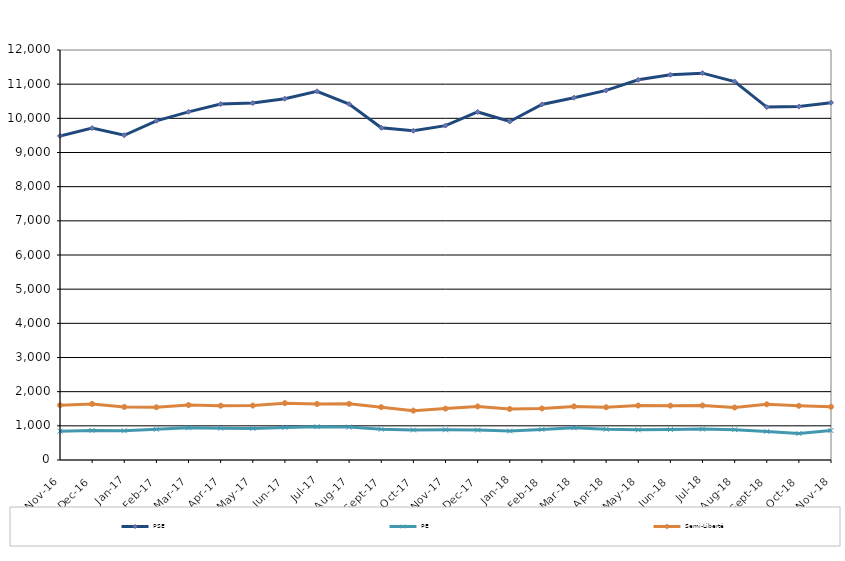
| Category | PSE | PE | Semi-Liberté |
|---|---|---|---|
| 2016-11-01 | 9484 | 844 | 1605 |
| 2016-12-01 | 9714 | 866 | 1641 |
| 2017-01-01 | 9505 | 855 | 1553 |
| 2017-02-01 | 9927 | 900 | 1542 |
| 2017-03-01 | 10190 | 942 | 1607 |
| 2017-04-01 | 10417 | 931 | 1590 |
| 2017-05-01 | 10448 | 924 | 1594 |
| 2017-06-01 | 10575 | 951 | 1664 |
| 2017-07-01 | 10791 | 974 | 1639 |
| 2017-08-01 | 10417 | 963 | 1644 |
| 2017-09-01 | 9723 | 903 | 1547 |
| 2017-10-01 | 9637 | 879 | 1445 |
| 2017-11-01 | 9787 | 885 | 1504 |
| 2017-12-01 | 10187 | 876 | 1568 |
| 2018-01-01 | 9907 | 847 | 1493 |
| 2018-02-01 | 10406 | 895 | 1508 |
| 2018-03-01 | 10603 | 942 | 1569 |
| 2018-04-01 | 10817 | 901 | 1544 |
| 2018-05-01 | 11127 | 882 | 1594 |
| 2018-06-01 | 11275 | 890 | 1591 |
| 2018-07-01 | 11322 | 905 | 1596 |
| 2018-08-01 | 11075 | 888 | 1537 |
| 2018-09-01 | 10329 | 837 | 1630 |
| 2018-10-01 | 10344 | 776 | 1587 |
| 2018-11-01 | 10458 | 863 | 1557 |